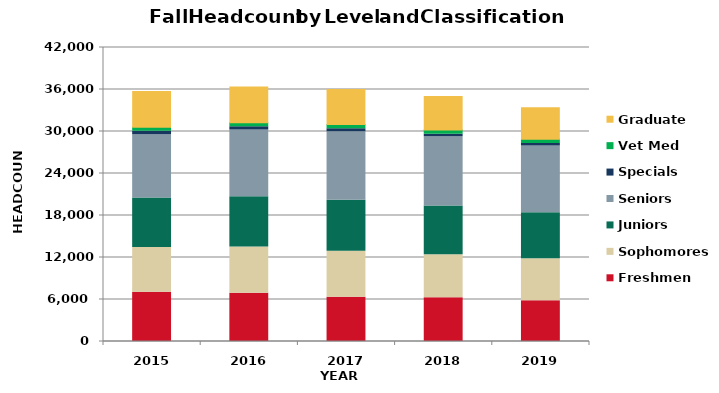
| Category | Freshmen | Sophomores | Juniors | Seniors | Specials | Vet Med | Graduate |
|---|---|---|---|---|---|---|---|
| 2015.0 | 7033 | 6408 | 7058 | 9021 | 514 | 584 | 5096 |
| 2016.0 | 6879 | 6611 | 7187 | 9547 | 447 | 586 | 5096 |
| 2017.0 | 6319 | 6557 | 7291 | 9790 | 449 | 596 | 4991 |
| 2018.0 | 6249 | 6157 | 6936 | 9906 | 373 | 597 | 4774 |
| 2019.0 | 5828 | 5984 | 6565 | 9553 | 364 | 599 | 4498 |